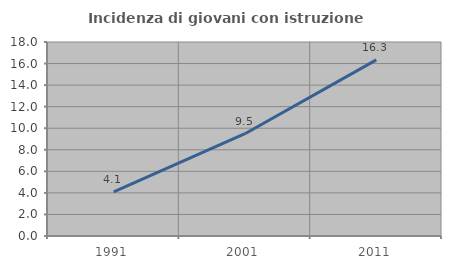
| Category | Incidenza di giovani con istruzione universitaria |
|---|---|
| 1991.0 | 4.098 |
| 2001.0 | 9.489 |
| 2011.0 | 16.346 |